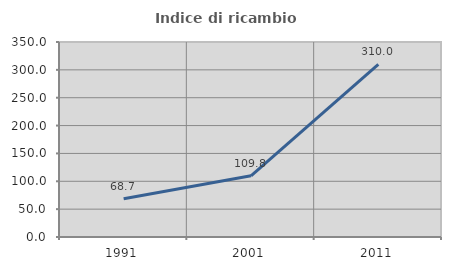
| Category | Indice di ricambio occupazionale  |
|---|---|
| 1991.0 | 68.707 |
| 2001.0 | 109.848 |
| 2011.0 | 310 |